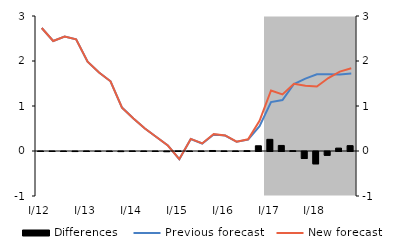
| Category | Differences |
|---|---|
| 0 | 0 |
| 1 | 0 |
| 2 | 0 |
| 3 | -0.001 |
| 4 | 0.001 |
| 5 | 0.001 |
| 6 | -0.001 |
| 7 | -0.002 |
| 8 | 0.002 |
| 9 | 0.001 |
| 10 | 0 |
| 11 | -0.003 |
| 12 | 0.002 |
| 13 | 0.001 |
| 14 | 0.001 |
| 15 | 0.011 |
| 16 | 0.002 |
| 17 | 0.001 |
| 18 | 0.007 |
| 19 | 0.116 |
| 20 | 0.259 |
| 21 | 0.123 |
| 22 | 0.007 |
| 23 | -0.156 |
| 24 | -0.273 |
| 25 | -0.084 |
| 26 | 0.064 |
| 27 | 0.119 |